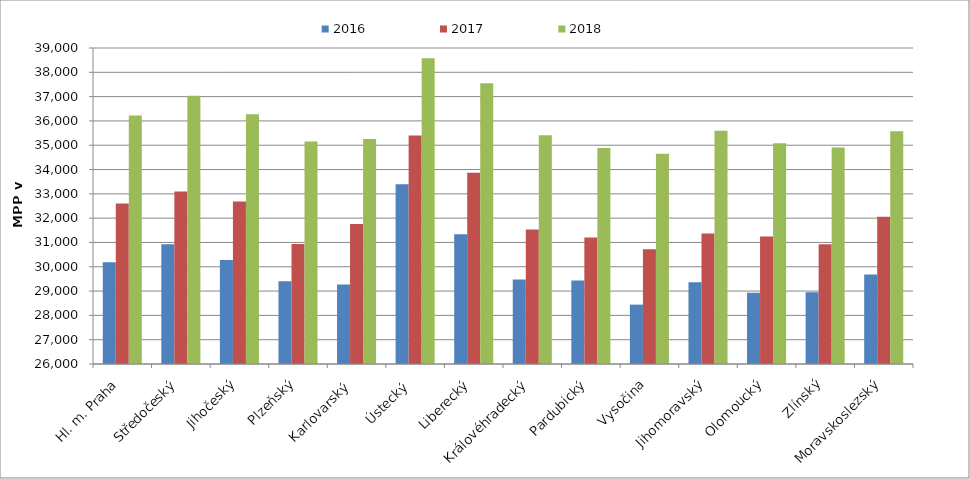
| Category | 2016 | 2017 | 2018 |
|---|---|---|---|
| Hl. m. Praha | 30184.186 | 32599.814 | 36223.256 |
| Středočeský | 30928.604 | 33100.274 | 37035.501 |
| Jihočeský | 30275.072 | 32681.88 | 36277.395 |
| Plzeňský | 29403.694 | 30939.846 | 35154.617 |
| Karlovarský  | 29270.222 | 31756.496 | 35259.882 |
| Ústecký   | 33391.95 | 35395.666 | 38580.805 |
| Liberecký | 31340.208 | 33866.376 | 37546.099 |
| Královéhradecký | 29478.352 | 31530.237 | 35415.25 |
| Pardubický | 29431.663 | 31204.838 | 34884.069 |
| Vysočina | 28442.466 | 30718.151 | 34650 |
| Jihomoravský | 29366.637 | 31365.225 | 35595.41 |
| Olomoucký | 28928.977 | 31243.336 | 35085.813 |
| Zlínský | 28947.716 | 30931.15 | 34904.81 |
| Moravskoslezský | 29681.542 | 32062.249 | 35576.626 |